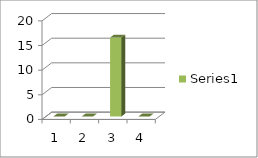
| Category | Series 0 |
|---|---|
| 0 | 0 |
| 1 | 0 |
| 2 | 16 |
| 3 | 0 |